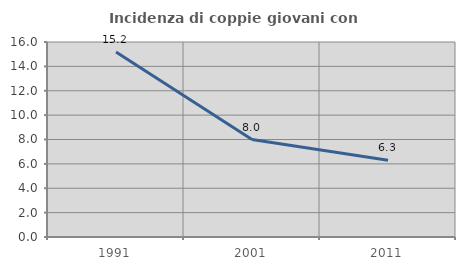
| Category | Incidenza di coppie giovani con figli |
|---|---|
| 1991.0 | 15.172 |
| 2001.0 | 8 |
| 2011.0 | 6.294 |